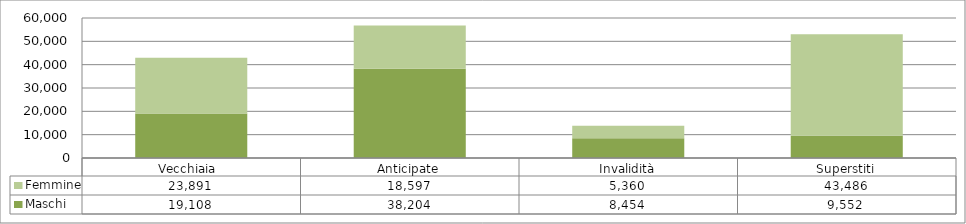
| Category | Maschi | Femmine |
|---|---|---|
| Vecchiaia  | 19108 | 23891 |
| Anticipate | 38204 | 18597 |
| Invalidità | 8454 | 5360 |
| Superstiti | 9552 | 43486 |